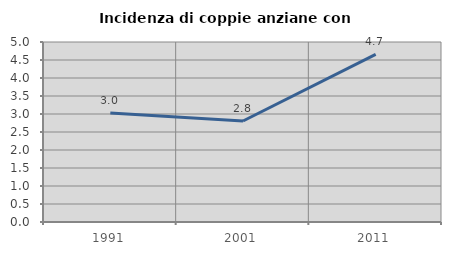
| Category | Incidenza di coppie anziane con figli |
|---|---|
| 1991.0 | 3.028 |
| 2001.0 | 2.805 |
| 2011.0 | 4.655 |